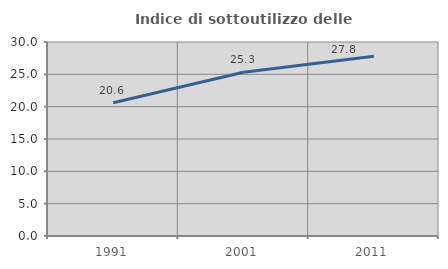
| Category | Indice di sottoutilizzo delle abitazioni  |
|---|---|
| 1991.0 | 20.607 |
| 2001.0 | 25.32 |
| 2011.0 | 27.789 |